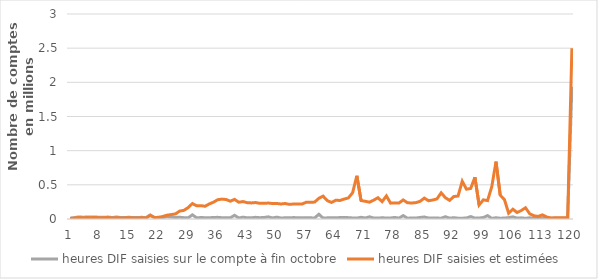
| Category | heures DIF saisies sur le compte à fin octobre | heures DIF saisies et estimées |
|---|---|---|
| 1.0 | 10717 | 8219 |
| 2.0 | 19526 | 14250 |
| 3.0 | 30815 | 20608 |
| 4.0 | 26789 | 18483 |
| 5.0 | 28314 | 20523 |
| 6.0 | 28851 | 19621 |
| 7.0 | 29807 | 22101 |
| 8.0 | 24383 | 17644 |
| 9.0 | 24580 | 17891 |
| 10.0 | 28671 | 21939 |
| 11.0 | 21077 | 15501 |
| 12.0 | 29421 | 19740 |
| 13.0 | 21454 | 15733 |
| 14.0 | 22071 | 16437 |
| 15.0 | 25055 | 19496 |
| 16.0 | 21067 | 15974 |
| 17.0 | 20869 | 15959 |
| 18.0 | 24904 | 16992 |
| 19.0 | 19348 | 15108 |
| 20.0 | 59104 | 52659 |
| 21.0 | 22367 | 20378 |
| 22.0 | 22133 | 25309 |
| 23.0 | 21359 | 36609 |
| 24.0 | 32435 | 56299 |
| 25.0 | 27908 | 65088 |
| 26.0 | 22079 | 74699 |
| 27.0 | 25595 | 115970 |
| 28.0 | 19259 | 126638 |
| 29.0 | 17184 | 167256 |
| 30.0 | 61010 | 226254 |
| 31.0 | 17161 | 193434 |
| 32.0 | 21469 | 195419 |
| 33.0 | 19300 | 186308 |
| 34.0 | 17914 | 220054 |
| 35.0 | 23321 | 245912 |
| 36.0 | 23900 | 282037 |
| 37.0 | 18987 | 291158 |
| 38.0 | 18071 | 285040 |
| 39.0 | 18339 | 260244 |
| 40.0 | 53802 | 287177 |
| 41.0 | 15030 | 245181 |
| 42.0 | 26689 | 255208 |
| 43.0 | 17995 | 239161 |
| 44.0 | 17869 | 235396 |
| 45.0 | 24477 | 240890 |
| 46.0 | 19216 | 228860 |
| 47.0 | 22204 | 228637 |
| 48.0 | 31703 | 233550 |
| 49.0 | 15360 | 226482 |
| 50.0 | 26888 | 227253 |
| 51.0 | 14725 | 219726 |
| 52.0 | 17650 | 226667 |
| 53.0 | 16591 | 214126 |
| 54.0 | 20869 | 219358 |
| 55.0 | 18683 | 219015 |
| 56.0 | 16401 | 218870 |
| 57.0 | 17649 | 245233 |
| 58.0 | 16994 | 243336 |
| 59.0 | 15287 | 247941 |
| 60.0 | 69556 | 303060 |
| 61.0 | 13113 | 334108 |
| 62.0 | 16782 | 268258 |
| 63.0 | 18259 | 242332 |
| 64.0 | 18426 | 274602 |
| 65.0 | 20796 | 271503 |
| 66.0 | 21576 | 291530 |
| 67.0 | 19943 | 308557 |
| 68.0 | 15383 | 384701 |
| 69.0 | 13727 | 632773 |
| 70.0 | 24632 | 270143 |
| 71.0 | 14905 | 259392 |
| 72.0 | 31811 | 246532 |
| 73.0 | 14853 | 275655 |
| 74.0 | 14267 | 311057 |
| 75.0 | 17768 | 254096 |
| 76.0 | 15103 | 337761 |
| 77.0 | 15295 | 232269 |
| 78.0 | 22420 | 234022 |
| 79.0 | 13239 | 234119 |
| 80.0 | 49851 | 279184 |
| 81.0 | 11595 | 237463 |
| 82.0 | 14550 | 234086 |
| 83.0 | 13916 | 239684 |
| 84.0 | 22412 | 258692 |
| 85.0 | 28933 | 305780 |
| 86.0 | 14558 | 267970 |
| 87.0 | 16140 | 277377 |
| 88.0 | 13920 | 294203 |
| 89.0 | 11499 | 383002 |
| 90.0 | 33562 | 311401 |
| 91.0 | 12553 | 272810 |
| 92.0 | 19290 | 328969 |
| 93.0 | 12291 | 336132 |
| 94.0 | 12091 | 552317 |
| 95.0 | 14474 | 435911 |
| 96.0 | 36122 | 447079 |
| 97.0 | 12503 | 610901 |
| 98.0 | 14255 | 204881 |
| 99.0 | 21742 | 280393 |
| 100.0 | 49488 | 269495 |
| 101.0 | 9144 | 471874 |
| 102.0 | 18305 | 839611 |
| 103.0 | 11339 | 348528 |
| 104.0 | 14144 | 283522 |
| 105.0 | 19868 | 83927 |
| 106.0 | 31510 | 142327 |
| 107.0 | 13351 | 94554 |
| 108.0 | 16766 | 124402 |
| 109.0 | 9754 | 165090 |
| 110.0 | 17893 | 75468 |
| 111.0 | 9245 | 48290 |
| 112.0 | 16271 | 37781 |
| 113.0 | 16734 | 59974 |
| 114.0 | 13762 | 30205 |
| 115.0 | 11383 | 15931 |
| 116.0 | 11405 | 18556 |
| 117.0 | 10557 | 18454 |
| 118.0 | 11087 | 16514 |
| 119.0 | 15474 | 18254 |
| 120.0 | 1936981 | 2499181 |